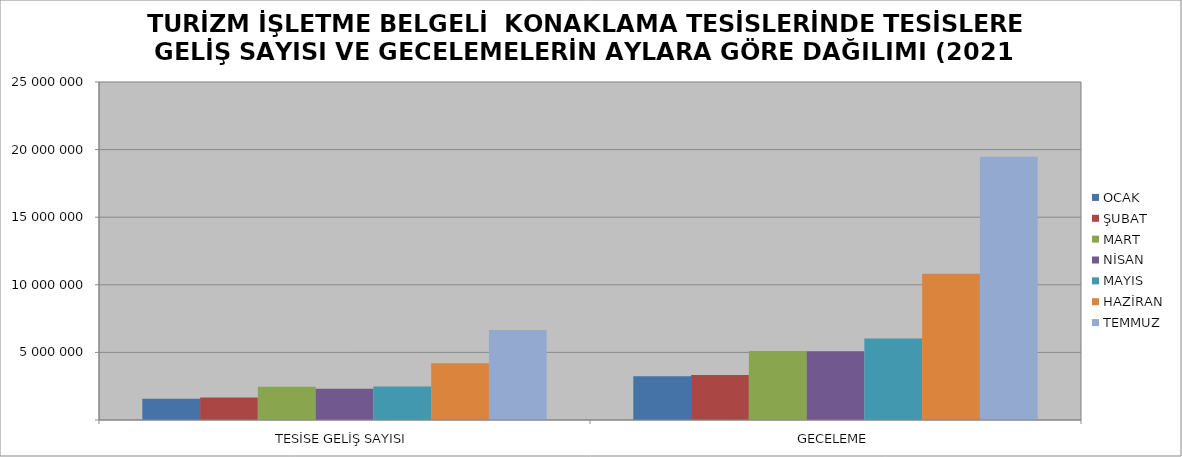
| Category | OCAK | ŞUBAT | MART | NİSAN | MAYIS | HAZİRAN | TEMMUZ |
|---|---|---|---|---|---|---|---|
| TESİSE GELİŞ SAYISI | 1571594 | 1670164 | 2462715 | 2305703 | 2480312 | 4203299 | 6647723 |
| GECELEME | 3239980 | 3333484 | 5094921 | 5081446 | 6019981 | 10819754 | 19475865 |